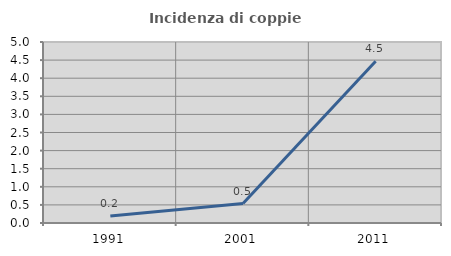
| Category | Incidenza di coppie miste |
|---|---|
| 1991.0 | 0.191 |
| 2001.0 | 0.538 |
| 2011.0 | 4.466 |